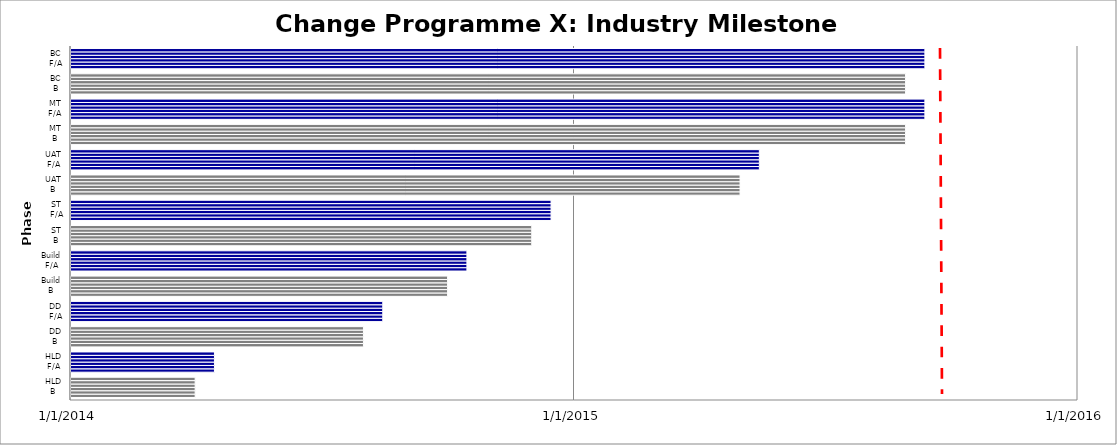
| Category | Shipper 1 | Shipper 2 | Shipper 3 | Shipper 4 | Shipper 5 | Shipper 6 |
|---|---|---|---|---|---|---|
| HLD
B | 4/1/14 | 4/1/14 | 4/1/14 | 4/1/14 | 4/1/14 | 4/1/14 |
| HLD
F/A | 4/15/14 | 4/15/14 | 4/15/14 | 4/15/14 | 4/15/14 | 4/15/14 |
| DD
B | 8/1/14 | 8/1/14 | 8/1/14 | 8/1/14 | 8/1/14 | 8/1/14 |
| DD
F/A | 8/15/14 | 8/15/14 | 8/15/14 | 8/15/14 | 8/15/14 | 8/15/14 |
| Build
B | 10/1/14 | 10/1/14 | 10/1/14 | 10/1/14 | 10/1/14 | 10/1/14 |
| Build
F/A | 10/15/14 | 10/15/14 | 10/15/14 | 10/15/14 | 10/15/14 | 10/15/14 |
| ST
B | 12/1/14 | 12/1/14 | 12/1/14 | 12/1/14 | 12/1/14 | 12/1/14 |
| ST
F/A | 12/15/14 | 12/15/14 | 12/15/14 | 12/15/14 | 12/15/14 | 12/15/14 |
| UAT
B | 5/1/15 | 5/1/15 | 5/1/15 | 5/1/15 | 5/1/15 | 5/1/15 |
| UAT
F/A | 5/15/15 | 5/15/15 | 5/15/15 | 5/15/15 | 5/15/15 | 5/15/15 |
| MT
B | 8/29/15 | 8/29/15 | 8/29/15 | 8/29/15 | 8/29/15 | 8/29/15 |
| MT
F/A | 9/12/15 | 9/12/15 | 9/12/15 | 9/12/15 | 9/12/15 | 9/12/15 |
| BC
B | 8/29/15 | 8/29/15 | 8/29/15 | 8/29/15 | 8/29/15 | 8/29/15 |
| BC
F/A | 9/12/15 | 9/12/15 | 9/12/15 | 9/12/15 | 9/12/15 | 9/12/15 |